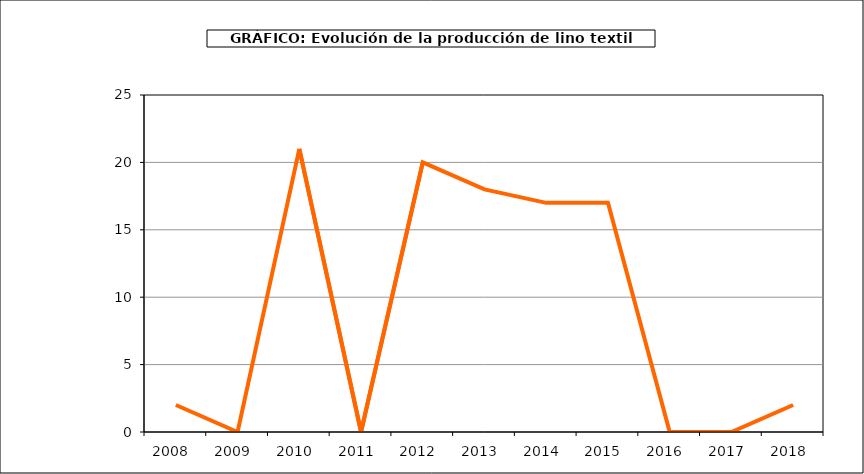
| Category | producción |
|---|---|
| 2008.0 | 2 |
| 2009.0 | 0 |
| 2010.0 | 21 |
| 2011.0 | 0 |
| 2012.0 | 20 |
| 2013.0 | 18 |
| 2014.0 | 17 |
| 2015.0 | 17 |
| 2016.0 | 0 |
| 2017.0 | 0 |
| 2018.0 | 2 |